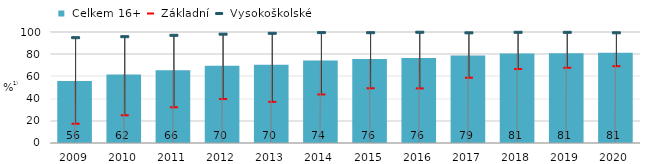
| Category |  Celkem 16+ |
|---|---|
| 2009.0 | 55.9 |
| 2010.0 | 61.8 |
| 2011.0 | 65.5 |
| 2012.0 | 69.5 |
| 2013.0 | 70.4 |
| 2014.0 | 74.232 |
| 2015.0 | 75.669 |
| 2016.0 | 76.481 |
| 2017.0 | 78.8 |
| 2018.0 | 80.7 |
| 2019.0 | 80.9 |
| 2020.0 | 81.339 |